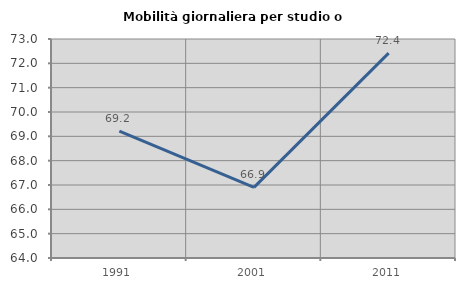
| Category | Mobilità giornaliera per studio o lavoro |
|---|---|
| 1991.0 | 69.213 |
| 2001.0 | 66.904 |
| 2011.0 | 72.419 |